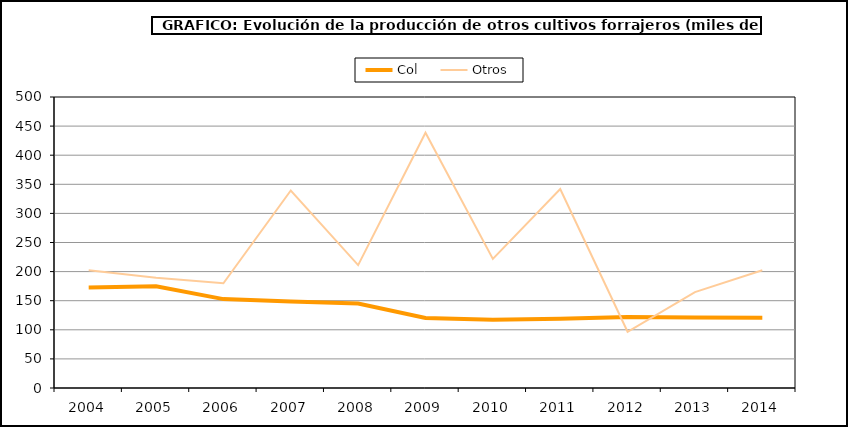
| Category | Col | Otros |
|---|---|---|
| 2004.0 | 172.843 | 202.224 |
| 2005.0 | 174.642 | 189.504 |
| 2006.0 | 152.735 | 179.843 |
| 2007.0 | 148.425 | 339.369 |
| 2008.0 | 145.208 | 211.156 |
| 2009.0 | 120.292 | 438.536 |
| 2010.0 | 117.345 | 221.872 |
| 2011.0 | 118.869 | 341.873 |
| 2012.0 | 122.008 | 96.567 |
| 2013.0 | 121.043 | 164.745 |
| 2014.0 | 120.638 | 202.445 |